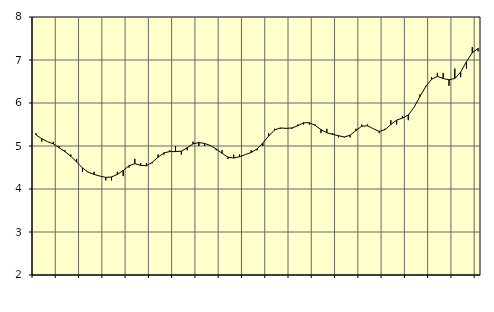
| Category | Piggar | Information och kommunikation, SNI 58-63 |
|---|---|---|
| nan | 5.3 | 5.26 |
| 1.0 | 5.1 | 5.17 |
| 1.0 | 5.1 | 5.1 |
| 1.0 | 5.1 | 5.05 |
| nan | 5 | 4.96 |
| 2.0 | 4.9 | 4.87 |
| 2.0 | 4.8 | 4.76 |
| 2.0 | 4.7 | 4.63 |
| nan | 4.4 | 4.49 |
| 3.0 | 4.4 | 4.39 |
| 3.0 | 4.4 | 4.34 |
| 3.0 | 4.3 | 4.3 |
| nan | 4.2 | 4.27 |
| 4.0 | 4.2 | 4.28 |
| 4.0 | 4.4 | 4.34 |
| 4.0 | 4.3 | 4.43 |
| nan | 4.5 | 4.54 |
| 5.0 | 4.7 | 4.59 |
| 5.0 | 4.6 | 4.55 |
| 5.0 | 4.6 | 4.54 |
| nan | 4.6 | 4.62 |
| 6.0 | 4.8 | 4.74 |
| 6.0 | 4.8 | 4.84 |
| 6.0 | 4.9 | 4.87 |
| nan | 5 | 4.87 |
| 7.0 | 4.8 | 4.88 |
| 7.0 | 4.9 | 4.96 |
| 7.0 | 5.1 | 5.05 |
| nan | 5 | 5.08 |
| 8.0 | 5 | 5.06 |
| 8.0 | 5 | 5.01 |
| 8.0 | 4.9 | 4.93 |
| nan | 4.9 | 4.83 |
| 9.0 | 4.7 | 4.74 |
| 9.0 | 4.8 | 4.72 |
| 9.0 | 4.8 | 4.75 |
| nan | 4.8 | 4.8 |
| 10.0 | 4.9 | 4.85 |
| 10.0 | 4.9 | 4.93 |
| 10.0 | 5 | 5.07 |
| nan | 5.3 | 5.23 |
| 11.0 | 5.4 | 5.37 |
| 11.0 | 5.4 | 5.42 |
| 11.0 | 5.4 | 5.41 |
| nan | 5.4 | 5.42 |
| 12.0 | 5.5 | 5.47 |
| 12.0 | 5.5 | 5.54 |
| 12.0 | 5.5 | 5.54 |
| nan | 5.5 | 5.48 |
| 13.0 | 5.3 | 5.38 |
| 13.0 | 5.4 | 5.31 |
| 13.0 | 5.3 | 5.27 |
| nan | 5.2 | 5.24 |
| 14.0 | 5.2 | 5.21 |
| 14.0 | 5.2 | 5.25 |
| 14.0 | 5.4 | 5.36 |
| nan | 5.5 | 5.46 |
| 15.0 | 5.5 | 5.47 |
| 15.0 | 5.4 | 5.4 |
| 15.0 | 5.3 | 5.34 |
| nan | 5.4 | 5.38 |
| 16.0 | 5.6 | 5.5 |
| 16.0 | 5.5 | 5.6 |
| 16.0 | 5.7 | 5.65 |
| nan | 5.6 | 5.72 |
| 17.0 | 5.9 | 5.9 |
| 17.0 | 6.2 | 6.15 |
| 17.0 | 6.4 | 6.38 |
| nan | 6.6 | 6.55 |
| 18.0 | 6.7 | 6.62 |
| 18.0 | 6.7 | 6.57 |
| 18.0 | 6.4 | 6.54 |
| nan | 6.8 | 6.57 |
| 19.0 | 6.6 | 6.72 |
| 19.0 | 6.8 | 6.96 |
| 19.0 | 7.3 | 7.17 |
| nan | 7.2 | 7.27 |